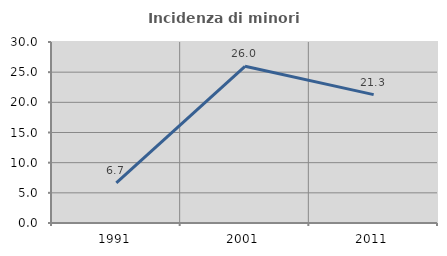
| Category | Incidenza di minori stranieri |
|---|---|
| 1991.0 | 6.667 |
| 2001.0 | 25.974 |
| 2011.0 | 21.277 |